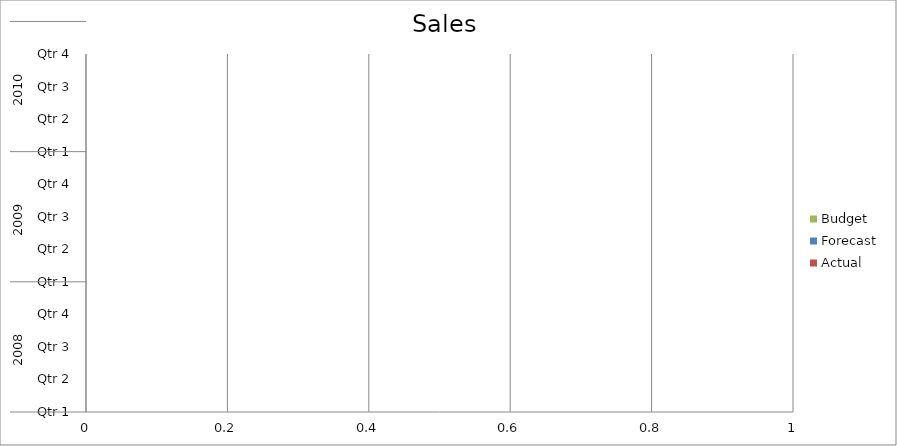
| Category | Budget | Forecast | Actual |
|---|---|---|---|
| 0 | 960 | 910 | 2160 |
| 1 | 610 | 780 | 2320 |
| 2 | 960 | 1020 | 520 |
| 3 | 2090 | 950 | 530 |
| 4 | 700 | 950 | 550 |
| 5 | 2770 | 3410 | 1440 |
| 6 | 650 | 1190 | 2230 |
| 7 | 2270 | 2630 | 1060 |
| 8 | 2000 | 1650 | 2670 |
| 9 | 2710 | 3060 | 2610 |
| 10 | 2830 | 2170 | 940 |
| 11 | 1240 | 2440 | 3140 |